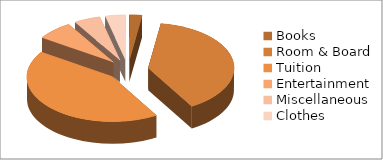
| Category | Series 0 | Series 1 | Series 2 | Series 3 |
|---|---|---|---|---|
| Books | 450 | 477 | 505.62 | 535.95 |
| Room & Board | 7500 | 7950 | 8427 | 8932.62 |
| Tuition | 8200 | 8692 | 9213.52 | 9766.33 |
| Entertainment | 1325 | 1404.5 | 1488.77 | 1578.1 |
| Miscellaneous | 950 | 1007 | 1067.42 | 1131.47 |
| Clothes | 725 | 768.5 | 814.61 | 863.49 |